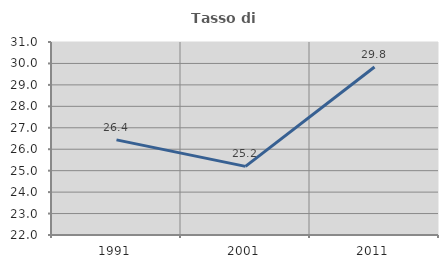
| Category | Tasso di occupazione   |
|---|---|
| 1991.0 | 26.436 |
| 2001.0 | 25.2 |
| 2011.0 | 29.835 |